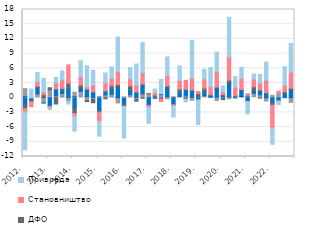
| Category | Непрофитне и друге организације | Локални ниво власти | Готов новац у oптицају | ДФО | Становништво | Привреда  |
|---|---|---|---|---|---|---|
| 2012. | 0.202 | 1.641 | -1.502 | -0.756 | -0.691 | -7.686 |
| II | 0.002 | -0.188 | -0.341 | -0.312 | -0.998 | 1.747 |
| III | 0.11 | 0.664 | 1.273 | 0.274 | 0.972 | 1.84 |
| IV | -0.138 | -0.873 | -0.098 | 0.61 | 0.594 | 2.749 |
| 2013. | 0.079 | 1.527 | -1.754 | 0.426 | -0.373 | -0.296 |
| II | 0.059 | 0.305 | 1.437 | -1.286 | 1.19 | 1.148 |
| III | 0.165 | 0.682 | 0.754 | 0.325 | 1.76 | 1.79 |
| IV | 0.076 | -0.87 | 1.873 | 1.027 | 3.718 | -0.415 |
| 2014. | 0.199 | 0.924 | -2.085 | -1.142 | -0.569 | -3.023 |
| II | 0.035 | 1.231 | 0.74 | 0.578 | 1.742 | 3.202 |
| III | 0.178 | -0.545 | 1.556 | -0.251 | 0.516 | 4.284 |
| IV | -0.104 | -0.237 | 1.19 | -0.68 | 1.391 | 3 |
| 2015. | -0.031 | 0.277 | -2.623 | -0.313 | -1.902 | -2.981 |
| II | 0.129 | 0.455 | 0.809 | -0.218 | 1.631 | 2.039 |
| III | 0.145 | 0.535 | 1.129 | 0.641 | 1.533 | 2.287 |
| IV | -0.109 | -1.155 | 2.237 | 0.437 | 2.676 | 7.032 |
| 2016. | 0.104 | -0.104 | -1.193 | -0.452 | -0.054 | -6.424 |
| II | -0.033 | 0.597 | 0.912 | 0.894 | 1.489 | 2.276 |
| III | 0.058 | -0.277 | 1.097 | -0.443 | 1.429 | 4.281 |
| IV | -0.001 | 0.781 | 1.984 | -0.118 | 2.31 | 6.213 |
| 2017. | 0.133 | 0.64 | -1.599 | 0.025 | -0.411 | -3.193 |
| II | 0.059 | 0.207 | -0.138 | 0.273 | 0.541 | 0.678 |
| III | 0.02 | 0.6 | 0.199 | -0.281 | -0.487 | 2.895 |
| IV | 0.183 | -0.435 | 2.116 | 0.066 | 2.148 | 3.798 |
| 2018. | -0.069 | 0.088 | -1.382 | 0.022 | -0.202 | -2.284 |
| II | 0.083 | 0.156 | 0.854 | 0.654 | 1.762 | 2.986 |
| III | 0.089 | 0.272 | 1.347 | -0.301 | 1.848 | -0.557 |
| IV | 0.082 | -0.727 | 1.258 | 0.234 | 2.481 | 7.641 |
| 2019. | 0.187 | 0.021 | -0.439 | 0.661 | 0.411 | -5.065 |
| II | -0.015 | 0.395 | 0.82 | 0.717 | 1.911 | 1.934 |
| III | 0.109 | -0.155 | 0.363 | 0.139 | 1.592 | 3.965 |
| IV | 0.106 | -0.756 | 1.801 | 0.269 | 3.171 | 3.974 |
| 2020. | -0.044 | 0.196 | 0.422 | -0.345 | 0.62 | 1.138 |
| II | 0.14 | -0.412 | 2.831 | 0.621 | 4.751 | 8.057 |
| III | 0.136 | 0.188 | -0.059 | 0.127 | 1.713 | 2.143 |
| IV | 0.323 | 0.01 | 1.279 | 0.077 | 2.288 | 2.209 |
| 2021. | 0.182 | 0.496 | -0.666 | -0.114 | 0.112 | -2.538 |
| II | 0.005 | 0.875 | 0.539 | 0.797 | 1.575 | 1.044 |
| III | 0.005 | 0.58 | 0.99 | -0.085 | 1.425 | 1.746 |
| IV | 0.001 | -0.875 | 0.906 | 0.121 | 2.584 | 3.656 |
| 2022. | 0.008 | 0.475 | -1.088 | -0.461 | -4.765 | -3.195 |
| II | -0.002 | 0.842 | -0.462 | -0.201 | 0.511 | -0.772 |
| III | -0.005 | -0.097 | 0.87 | 0.35 | 1.37 | 3.737 |
| IV | -0.006 | -1.134 | 1.656 | 0.277 | 3.299 | 5.835 |